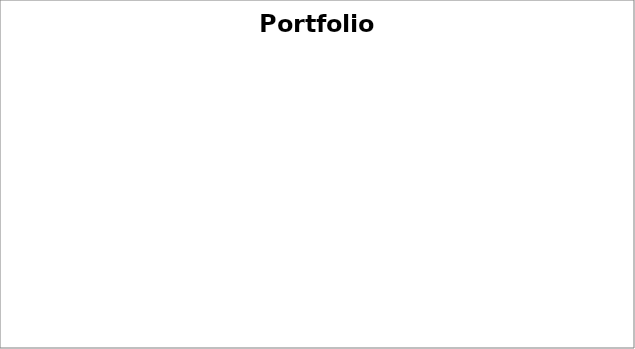
| Category | Портфель |
|---|---|
| Bonds | 0 |
| Stocks | 0 |
| ETF | 0 |